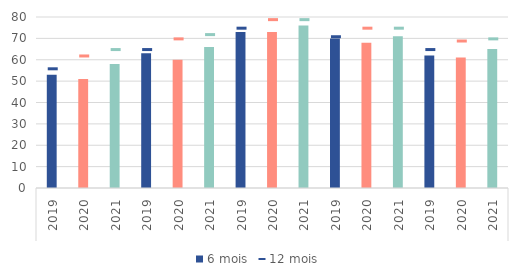
| Category | 6 mois |
|---|---|
| 0 | 53 |
| 1 | 51 |
| 2 | 58 |
| 3 | 63 |
| 4 | 60 |
| 5 | 66 |
| 6 | 73 |
| 7 | 73 |
| 8 | 76 |
| 9 | 70 |
| 10 | 68 |
| 11 | 71 |
| 12 | 62 |
| 13 | 61 |
| 14 | 65 |